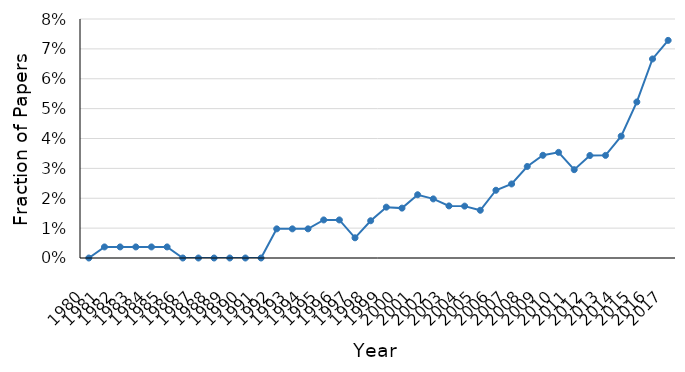
| Category | Top 1% |
|---|---|
| 1980.0 | 0 |
| 1981.0 | 0.004 |
| 1982.0 | 0.004 |
| 1983.0 | 0.004 |
| 1984.0 | 0.004 |
| 1985.0 | 0.004 |
| 1986.0 | 0 |
| 1987.0 | 0 |
| 1988.0 | 0 |
| 1989.0 | 0 |
| 1990.0 | 0 |
| 1991.0 | 0 |
| 1992.0 | 0.01 |
| 1993.0 | 0.01 |
| 1994.0 | 0.01 |
| 1995.0 | 0.013 |
| 1996.0 | 0.013 |
| 1997.0 | 0.007 |
| 1998.0 | 0.012 |
| 1999.0 | 0.017 |
| 2000.0 | 0.017 |
| 2001.0 | 0.021 |
| 2002.0 | 0.02 |
| 2003.0 | 0.017 |
| 2004.0 | 0.017 |
| 2005.0 | 0.016 |
| 2006.0 | 0.023 |
| 2007.0 | 0.025 |
| 2008.0 | 0.031 |
| 2009.0 | 0.034 |
| 2010.0 | 0.035 |
| 2011.0 | 0.03 |
| 2012.0 | 0.034 |
| 2013.0 | 0.034 |
| 2014.0 | 0.041 |
| 2015.0 | 0.052 |
| 2016.0 | 0.067 |
| 2017.0 | 0.073 |